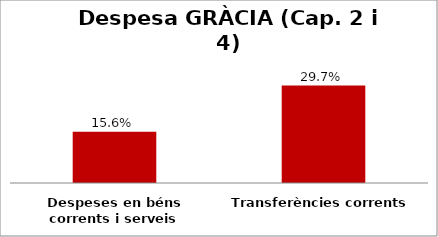
| Category | Series 0 |
|---|---|
| Despeses en béns corrents i serveis | 0.156 |
| Transferències corrents | 0.297 |